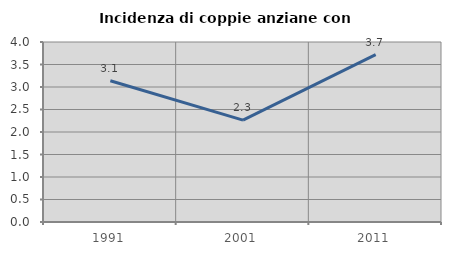
| Category | Incidenza di coppie anziane con figli |
|---|---|
| 1991.0 | 3.138 |
| 2001.0 | 2.264 |
| 2011.0 | 3.719 |